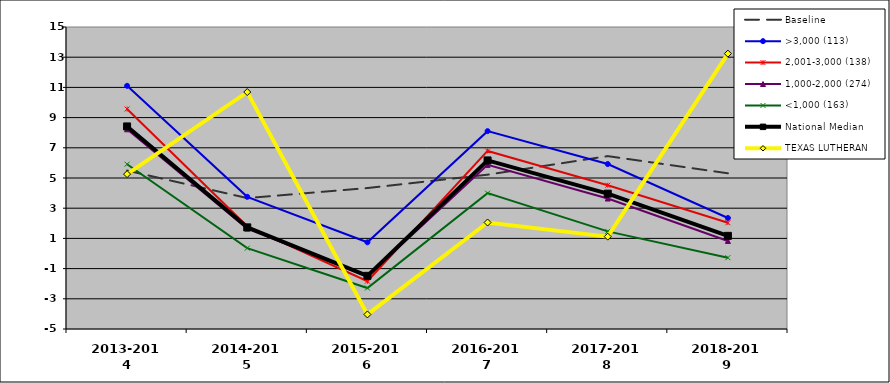
| Category | Baseline | >3,000 (113) | 2,001-3,000 (138) | 1,000-2,000 (274) | <1,000 (163) | National Median | TEXAS LUTHERAN |
|---|---|---|---|---|---|---|---|
| 2013-2014 | 5.492 | 11.104 | 9.567 | 8.225 | 5.913 | 8.415 | 5.258 |
| 2014-2015 | 3.67 | 3.753 | 1.799 | 1.652 | 0.354 | 1.73 | 10.692 |
| 2015-2016 | 4.335 | 0.742 | -1.835 | -1.51 | -2.289 | -1.479 | -4.036 |
| 2016-2017 | 5.22 | 8.103 | 6.793 | 5.869 | 3.996 | 6.164 | 2.053 |
| 2017-2018 | 6.45 | 5.925 | 4.521 | 3.64 | 1.466 | 3.963 | 1.117 |
| 2018-2019 | 5.311 | 2.35 | 2.038 | 0.831 | -0.278 | 1.169 | 13.237 |